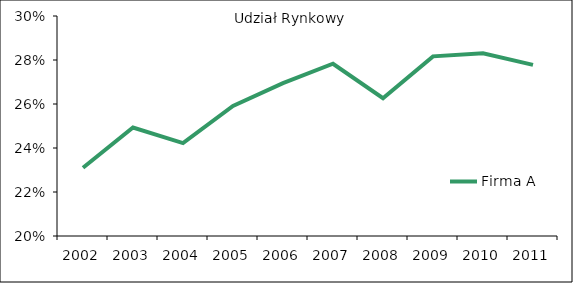
| Category | Firma A |
|---|---|
| 2002.0 | 0.231 |
| 2003.0 | 0.249 |
| 2004.0 | 0.242 |
| 2005.0 | 0.259 |
| 2006.0 | 0.27 |
| 2007.0 | 0.278 |
| 2008.0 | 0.263 |
| 2009.0 | 0.282 |
| 2010.0 | 0.283 |
| 2011.0 | 0.278 |